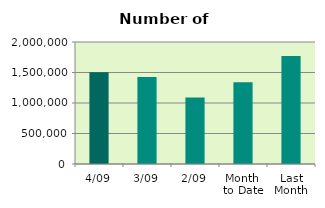
| Category | Series 0 |
|---|---|
| 4/09 | 1504036 |
| 3/09 | 1425074 |
| 2/09 | 1091134 |
| Month 
to Date | 1340081.333 |
| Last
Month | 1768562.909 |